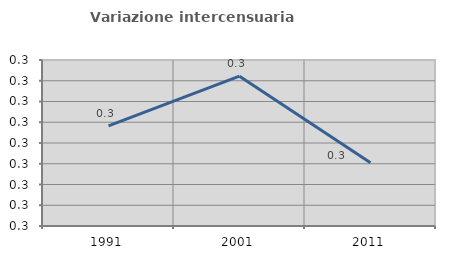
| Category | Variazione intercensuaria annua |
|---|---|
| 1991.0 | 0.298 |
| 2001.0 | 0.322 |
| 2011.0 | 0.281 |